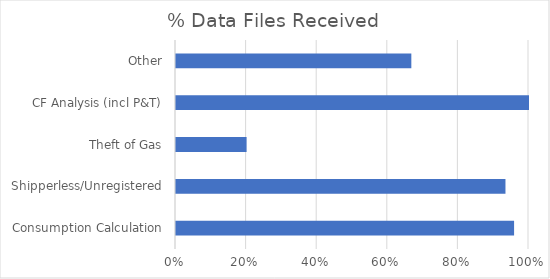
| Category | % Data Received |
|---|---|
| Consumption Calculation | 0.958 |
| Shipperless/Unregistered | 0.933 |
| Theft of Gas | 0.2 |
| CF Analysis (incl P&T) | 1 |
| Other | 0.667 |